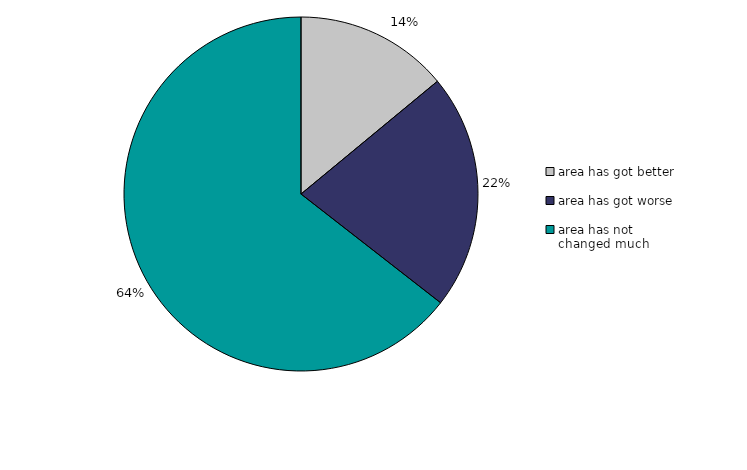
| Category | Series 0 |
|---|---|
| area has got better | 14.008 |
| area has got worse | 21.526 |
| area has not changed much | 64.466 |